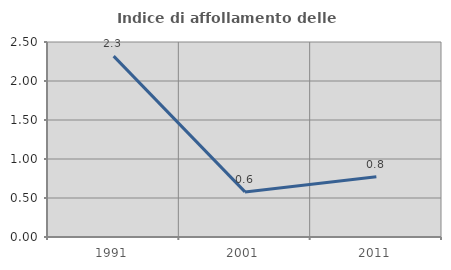
| Category | Indice di affollamento delle abitazioni  |
|---|---|
| 1991.0 | 2.318 |
| 2001.0 | 0.578 |
| 2011.0 | 0.772 |